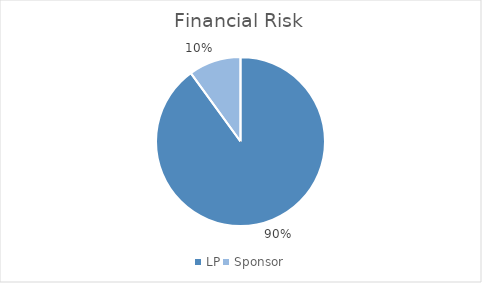
| Category | Series 0 |
|---|---|
| LP | 0.9 |
| Sponsor | 0.1 |